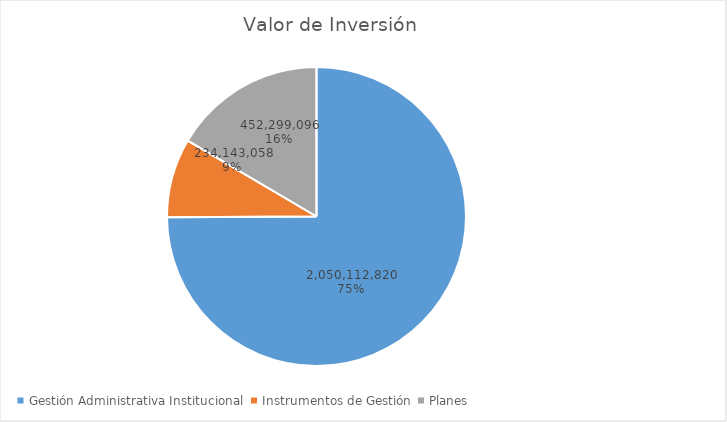
| Category | Valor de Inversión | Porcentaje de Ejecución dentro de la Actividad |
|---|---|---|
| Gestión Administrativa Institucional | 2050112820 | 7 |
| Instrumentos de Gestión | 234143058 | 2 |
| Planes | 452299096 | 4 |